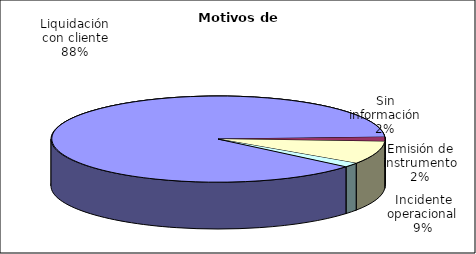
| Category | Motivos |
|---|---|
| Liquidación con cliente | 491 |
| Emisión de instrumento | 9 |
| Incidente operacional | 48 |
| Sin información | 9 |